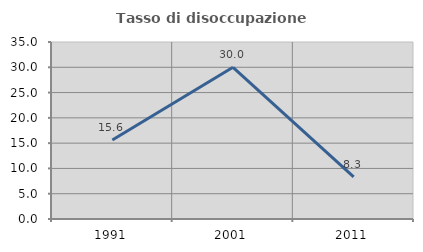
| Category | Tasso di disoccupazione giovanile  |
|---|---|
| 1991.0 | 15.625 |
| 2001.0 | 30 |
| 2011.0 | 8.333 |